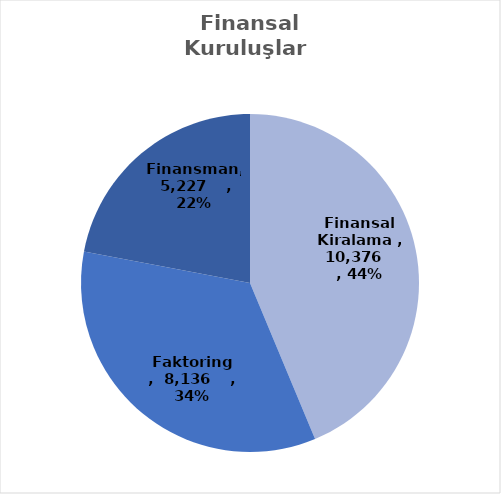
| Category | Series 0 |
|---|---|
| Finansal Kiralama  | 10376 |
| Faktoring  | 8136 |
| Finansman | 5227 |